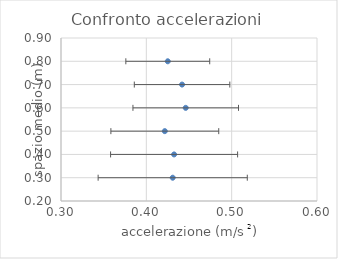
| Category | Series 0 |
|---|---|
| 0.43091065785693755 | 0.3 |
| 0.4325259515570935 | 0.4 |
| 0.42165626581210996 | 0.5 |
| 0.44616299821534805 | 0.6 |
| 0.4418634010857215 | 0.7 |
| 0.4251248804336274 | 0.8 |